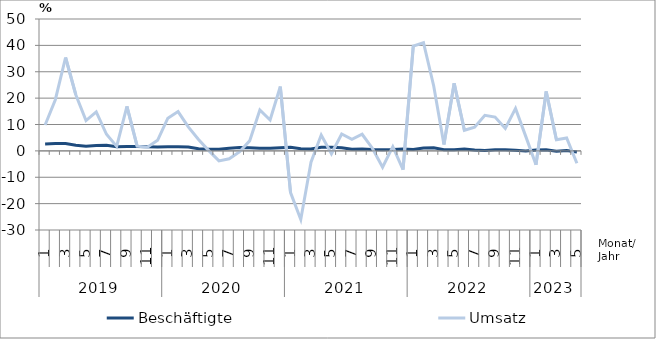
| Category | Beschäftigte | Umsatz |
|---|---|---|
| 0 | 2.6 | 9.8 |
| 1 | 2.8 | 19.4 |
| 2 | 2.8 | 35.4 |
| 3 | 2.1 | 21.3 |
| 4 | 1.8 | 11.5 |
| 5 | 2 | 14.8 |
| 6 | 2.1 | 6.3 |
| 7 | 1.6 | 1.7 |
| 8 | 1.7 | 16.9 |
| 9 | 1.7 | 1.8 |
| 10 | 1.6 | 1.4 |
| 11 | 1.5 | 4 |
| 12 | 1.6 | 12.4 |
| 13 | 1.6 | 14.9 |
| 14 | 1.5 | 9.1 |
| 15 | 0.8 | 4.3 |
| 16 | 0.6 | 0.1 |
| 17 | 0.6 | -3.8 |
| 18 | 1 | -3 |
| 19 | 1.3 | -0.4 |
| 20 | 1.2 | 3.8 |
| 21 | 1 | 15.5 |
| 22 | 1 | 11.7 |
| 23 | 1.2 | 24.4 |
| 24 | 1.4 | -15.8 |
| 25 | 0.8 | -26 |
| 26 | 0.7 | -4.3 |
| 27 | 1.4 | 6 |
| 28 | 1.4 | -1.1 |
| 29 | 1.2 | 6.4 |
| 30 | 0.6 | 4.4 |
| 31 | 0.7 | 6.3 |
| 32 | 0.5 | 1 |
| 33 | 0.4 | -6.2 |
| 34 | 0.5 | 1.6 |
| 35 | 0.7 | -7.1 |
| 36 | 0.5 | 39.7 |
| 37 | 1.1 | 41 |
| 38 | 1.2 | 24.6 |
| 39 | 0.4 | 2.4 |
| 40 | 0.4 | 25.6 |
| 41 | 0.7 | 7.8 |
| 42 | 0.3 | 9 |
| 43 | 0.1 | 13.5 |
| 44 | 0.4 | 12.8 |
| 45 | 0.4 | 8.5 |
| 46 | 0.2 | 16.1 |
| 47 | 0 | 5.5 |
| 48 | 0.3 | -5.3 |
| 49 | 0.4 | 22.5 |
| 50 | -0.1 | 4.2 |
| 51 | 0.1 | 4.9 |
| 52 | -0.4 | -4.7 |